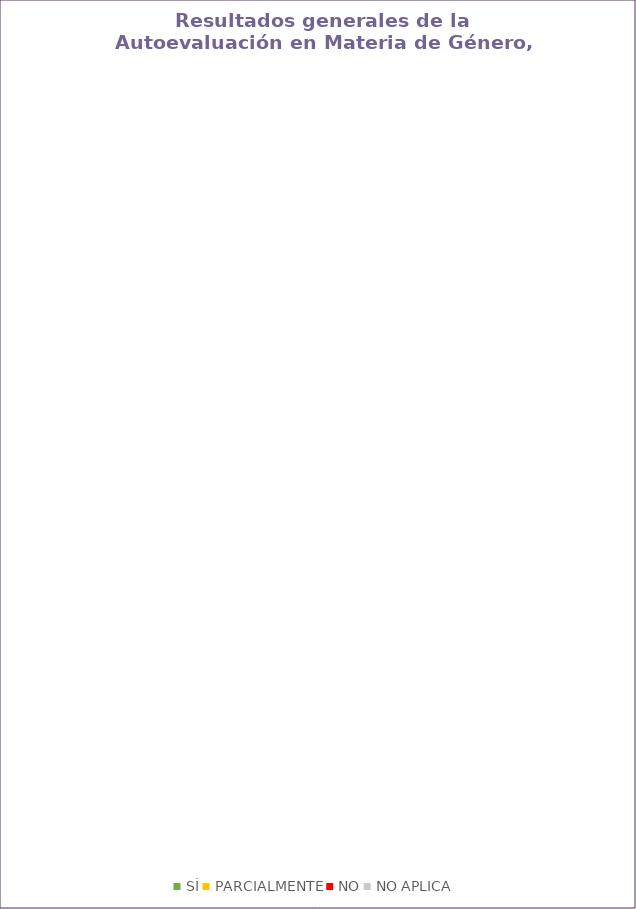
| Category | Series 0 |
|---|---|
| SÍ | 0 |
| PARCIALMENTE | 0 |
| NO | 0 |
| NO APLICA | 0 |